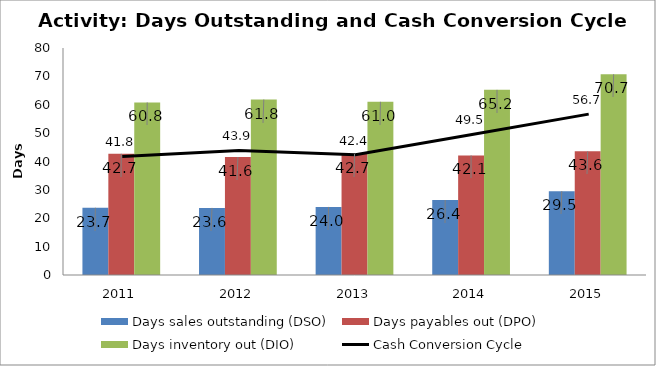
| Category | Days sales outstanding (DSO) | Days payables out (DPO) | Days inventory out (DIO) |
|---|---|---|---|
| 2011.0 | 23.697 | 42.717 | 60.813 |
| 2012.0 | 23.646 | 41.569 | 61.834 |
| 2013.0 | 23.988 | 42.659 | 61.041 |
| 2014.0 | 26.43 | 42.147 | 65.243 |
| 2015.0 | 29.55 | 43.587 | 70.74 |